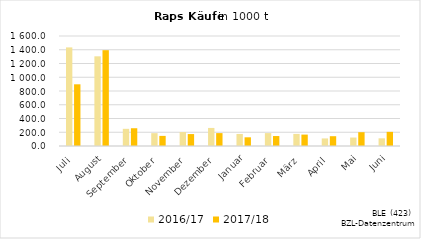
| Category | 2016/17 | 2017/18 |
|---|---|---|
| Juli | 1434.09 | 897.421 |
| August | 1304.347 | 1393.542 |
| September | 249.825 | 258.371 |
| Oktober | 186.746 | 147.015 |
| November | 202.86 | 173.58 |
| Dezember | 262.698 | 187.461 |
| Januar | 175.225 | 126.384 |
| Februar | 187.637 | 144.895 |
| März | 175.69 | 165.877 |
| April | 110.108 | 142.54 |
| Mai | 122.947 | 200.644 |
| Juni | 111.581 | 205.695 |